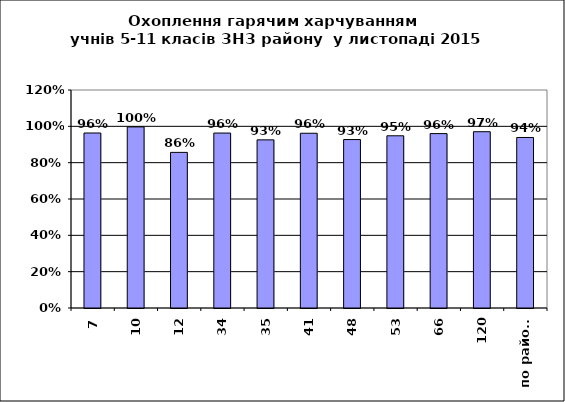
| Category | Series 0 |
|---|---|
| 7 | 0.963 |
| 10 | 0.997 |
| 12 | 0.857 |
| 34 | 0.963 |
| 35 | 0.926 |
| 41 | 0.962 |
| 48 | 0.927 |
| 53 | 0.948 |
| 66 | 0.96 |
| 120 | 0.97 |
| по району | 0.939 |